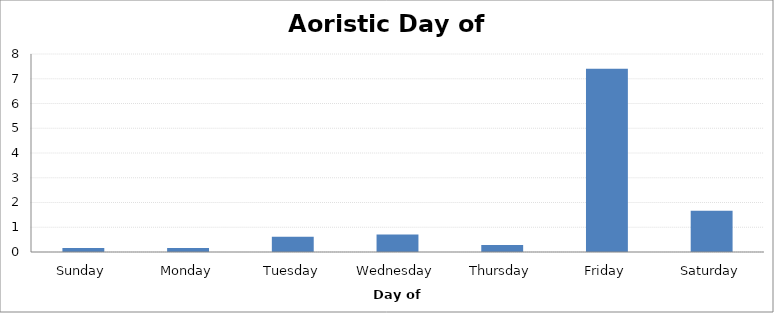
| Category | 0.164 0.164 0.618 0.711 0.280 7.399 1.663 |
|---|---|
| Sunday | 0.164 |
| Monday | 0.164 |
| Tuesday | 0.618 |
| Wednesday | 0.711 |
| Thursday | 0.28 |
| Friday | 7.399 |
| Saturday | 1.663 |